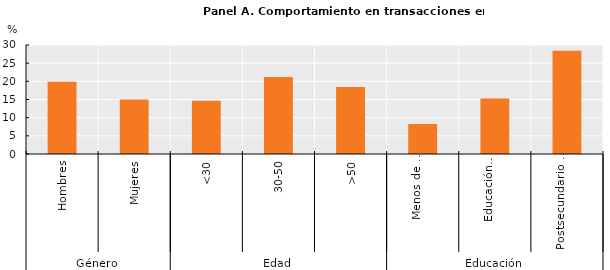
| Category | Comportamiento en transacciones en línea  |
|---|---|
| 0 | 19.893 |
| 1 | 15.012 |
| 2 | 14.672 |
| 3 | 21.219 |
| 4 | 18.434 |
| 5 | 8.263 |
| 6 | 15.249 |
| 7 | 28.395 |